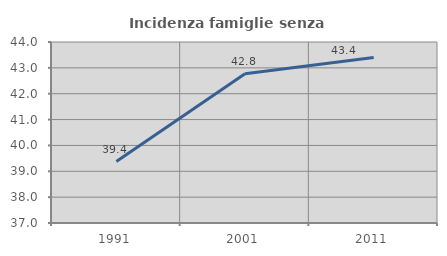
| Category | Incidenza famiglie senza nuclei |
|---|---|
| 1991.0 | 39.375 |
| 2001.0 | 42.775 |
| 2011.0 | 43.396 |